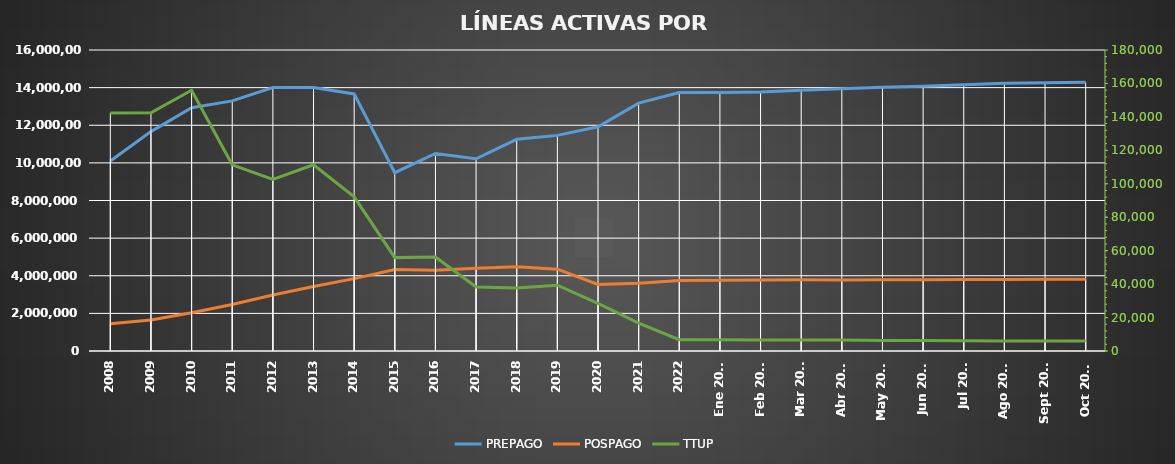
| Category | PREPAGO | POSPAGO |
|---|---|---|
| 2008 | 10097768 | 1452088 |
| 2009 | 11662294 | 1649838 |
| 2010 | 12929040 | 2033814 |
| 2011 | 13295834 | 2467378 |
| 2012 | 14008104 | 2976194 |
| 2013 | 14005126 | 3425277 |
| 2014 | 13666071 | 3846271 |
| 2015 | 9476240 | 4326937 |
| 2016 | 10498467 | 4293426 |
| 2017 | 10219457 | 4393703 |
| 2018 | 11254168 | 4480975 |
| 2019 | 11462048 | 4351686 |
| 2020 | 11917697 | 3539192 |
| 2021 | 13174530 | 3598383 |
| 2022 | 13740159 | 3743849 |
| Ene 2023 | 13744592 | 3762200 |
| Feb 2023 | 13771967 | 3773530 |
| Mar 2023 | 13859395 | 3786936 |
| Abr 2023 | 13944065 | 3768457 |
| May 2023 | 14014722 | 3780848 |
| Jun 2023 | 14075353 | 3791176 |
| Jul 2023 | 14147912 | 3799557 |
| Ago 2023 | 14231611 | 3807034 |
| Sept 2023 | 14265707 | 3810646 |
| Oct 2023 | 14279689 | 3814135 |